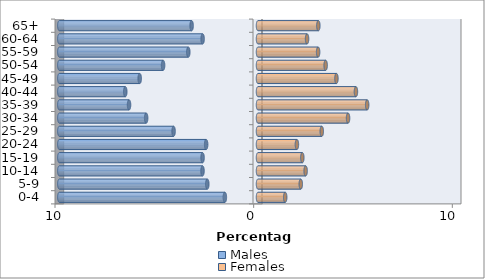
| Category | Males | Females |
|---|---|---|
| 0-4 | -1.668 | 1.37 |
| 5-9 | -2.552 | 2.153 |
| 10-14 | -2.794 | 2.397 |
| 15-19 | -2.791 | 2.231 |
| 20-24 | -2.61 | 1.958 |
| 25-29 | -4.249 | 3.21 |
| 30-34 | -5.63 | 4.533 |
| 35-39 | -6.492 | 5.495 |
| 40-44 | -6.681 | 4.93 |
| 45-49 | -5.955 | 3.948 |
| 50-54 | -4.777 | 3.405 |
| 55-59 | -3.508 | 3.026 |
| 60-64 | -2.788 | 2.469 |
| 65+ | -3.342 | 3.038 |